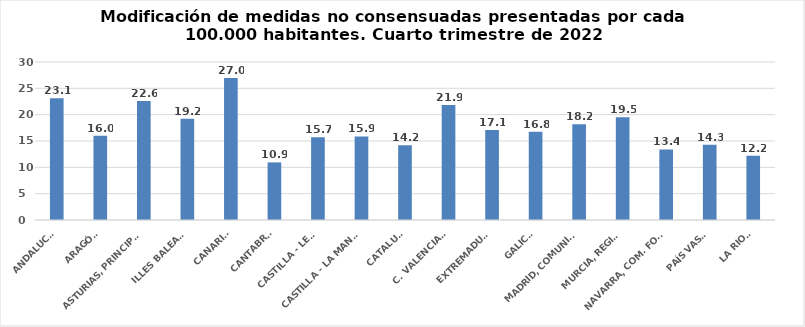
| Category | Series 0 |
|---|---|
| ANDALUCÍA | 23.107 |
| ARAGÓN | 15.984 |
| ASTURIAS, PRINCIPADO | 22.594 |
| ILLES BALEARS | 19.207 |
| CANARIAS | 26.955 |
| CANTABRIA | 10.933 |
| CASTILLA - LEÓN | 15.721 |
| CASTILLA - LA MANCHA | 15.877 |
| CATALUÑA | 14.206 |
| C. VALENCIANA | 21.852 |
| EXTREMADURA | 17.065 |
| GALICIA | 16.763 |
| MADRID, COMUNIDAD | 18.177 |
| MURCIA, REGIÓN | 19.519 |
| NAVARRA, COM. FORAL | 13.401 |
| PAÍS VASCO | 14.265 |
| LA RIOJA | 12.192 |